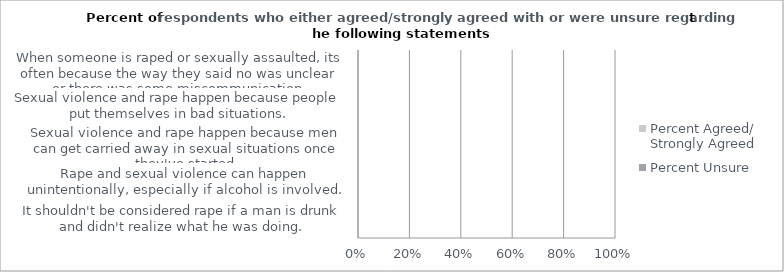
| Category | Percent Agreed/
Strongly Agreed | Percent Unsure |
|---|---|---|
| It shouldn't be considered rape if a man is drunk and didn't realize what he was doing. | 0 | 0 |
| Rape and sexual violence can happen unintentionally, especially if alcohol is involved. | 0 | 0 |
| Sexual violence and rape happen because men can get carried away in sexual situations once they've started. | 0 | 0 |
| Sexual violence and rape happen because people put themselves in bad situations. | 0 | 0 |
| When someone is raped or sexually assaulted, its often because the way they said no was unclear or there was some miscommunication. | 0 | 0 |